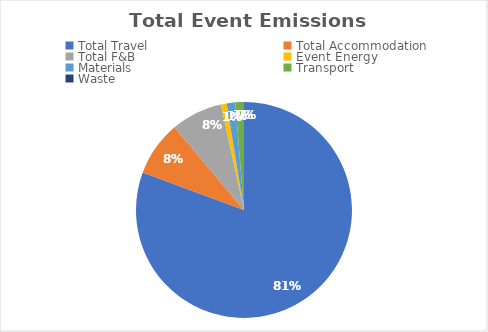
| Category | Series 0 |
|---|---|
| Total Travel | 7.54 |
| Total Accommodation | 0.77 |
| Total F&B | 0.72 |
| Event Energy | 0.08 |
| Materials | 0.12 |
| Transport | 0.12 |
| Waste | 0 |